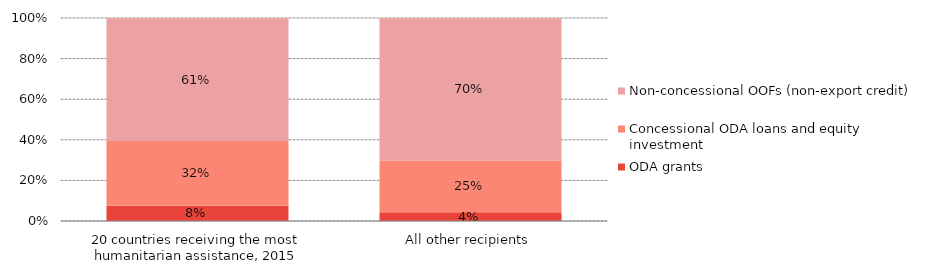
| Category | ODA grants | Concessional ODA loans and equity investment | Non-concessional OOFs (non-export credit) |
|---|---|---|---|
| 20 countries receiving the most humanitarian assistance, 2015 | 0.075 | 0.319 | 0.606 |
| All other recipients | 0.043 | 0.254 | 0.703 |